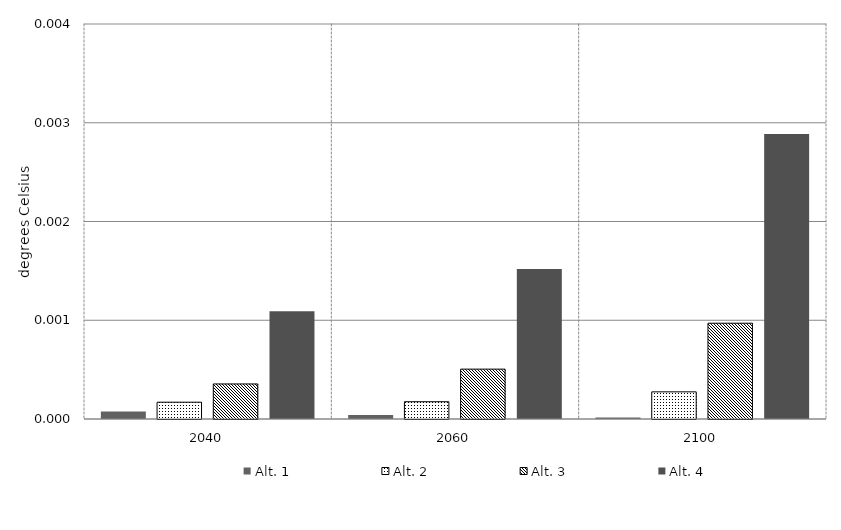
| Category | Alt. 1 | Alt. 2 | Alt. 3 | Alt. 4 | Alt 5 | Alt 6 | Alt 7 | Alt 8 | Alt 10 |
|---|---|---|---|---|---|---|---|---|---|
| 2040.0 | 0 | 0 | 0 | 0.001 |  |  |  |  |  |
| 2060.0 | 0 | 0 | 0.001 | 0.002 |  |  |  |  |  |
| 2100.0 | 0 | 0 | 0.001 | 0.003 |  |  |  |  |  |